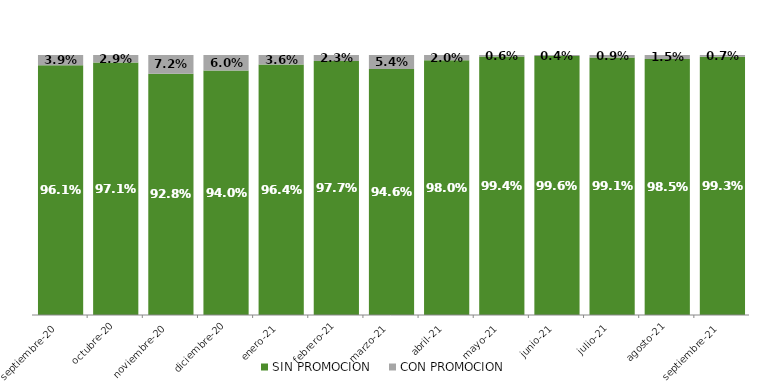
| Category | SIN PROMOCION   | CON PROMOCION   |
|---|---|---|
| 2020-09-01 | 0.961 | 0.039 |
| 2020-10-01 | 0.971 | 0.029 |
| 2020-11-01 | 0.928 | 0.072 |
| 2020-12-01 | 0.94 | 0.06 |
| 2021-01-01 | 0.964 | 0.036 |
| 2021-02-01 | 0.977 | 0.023 |
| 2021-03-01 | 0.946 | 0.054 |
| 2021-04-01 | 0.98 | 0.02 |
| 2021-05-01 | 0.994 | 0.006 |
| 2021-06-01 | 0.996 | 0.004 |
| 2021-07-01 | 0.991 | 0.009 |
| 2021-08-01 | 0.985 | 0.015 |
| 2021-09-01 | 0.993 | 0.007 |